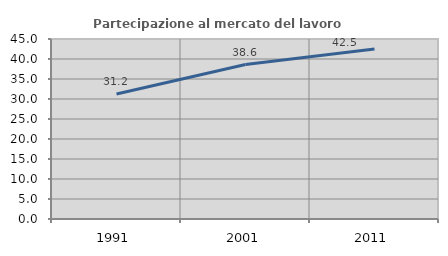
| Category | Partecipazione al mercato del lavoro  femminile |
|---|---|
| 1991.0 | 31.235 |
| 2001.0 | 38.609 |
| 2011.0 | 42.484 |